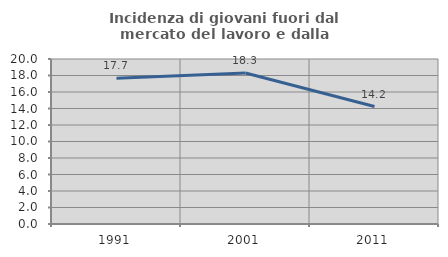
| Category | Incidenza di giovani fuori dal mercato del lavoro e dalla formazione  |
|---|---|
| 1991.0 | 17.679 |
| 2001.0 | 18.308 |
| 2011.0 | 14.24 |